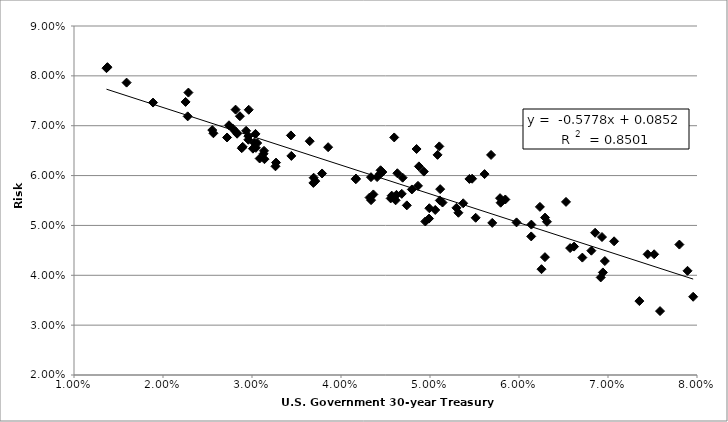
| Category | Series 0 |
|---|---|
| 0.07802062499999997 | 0.046 |
| 0.07893437499999999 | 0.041 |
| 0.07445446153846155 | 0.044 |
| 0.07518469696969694 | 0.044 |
| 0.07068396825396826 | 0.047 |
| 0.06855323076923074 | 0.049 |
| 0.06314272727272731 | 0.051 |
| 0.061389999999999986 | 0.05 |
| 0.06574515624999999 | 0.045 |
| 0.07352630769230767 | 0.035 |
| 0.07584772727272729 | 0.033 |
| 0.07956846153846153 | 0.036 |
| 0.06942584615384617 | 0.041 |
| 0.06711861538461537 | 0.044 |
| 0.06234815384615382 | 0.054 |
| 0.06292569230769232 | 0.052 |
| 0.06918323076923079 | 0.04 |
| 0.06964469696969697 | 0.043 |
| 0.06619 | 0.046 |
| 0.06813328125000001 | 0.045 |
| 0.06932415384615384 | 0.048 |
| 0.06528166666666667 | 0.055 |
| 0.06137227272727274 | 0.048 |
| 0.05846246153846155 | 0.055 |
| 0.05473196969696969 | 0.059 |
| 0.05104727272727275 | 0.066 |
| 0.05372968750000002 | 0.054 |
| 0.05794030769230768 | 0.055 |
| 0.06252848484848486 | 0.041 |
| 0.06291261538461539 | 0.044 |
| 0.059723230769230765 | 0.051 |
| 0.05787187500000002 | 0.055 |
| 0.05686107692307691 | 0.064 |
| 0.054425937500000014 | 0.059 |
| 0.05699338461538464 | 0.051 |
| 0.05297090909090909 | 0.054 |
| 0.0551321875 | 0.052 |
| 0.05612915384615385 | 0.06 |
| 0.0508485909090909 | 0.064 |
| 0.049307318181818195 | 0.061 |
| 0.048490953125 | 0.065 |
| 0.04597904615384617 | 0.068 |
| 0.051104863636363636 | 0.055 |
| 0.05114219696969698 | 0.057 |
| 0.048753138461538476 | 0.062 |
| 0.05319286153846153 | 0.053 |
| 0.05058801515151515 | 0.053 |
| 0.04864845454545455 | 0.058 |
| 0.046927312499999985 | 0.06 |
| 0.04465093846153847 | 0.061 |
| 0.044381742424242414 | 0.06 |
| 0.046829078125 | 0.056 |
| 0.04633183076923076 | 0.06 |
| 0.05140650769230769 | 0.055 |
| 0.0499256923076923 | 0.053 |
| 0.04739560000000001 | 0.054 |
| 0.047964107692307696 | 0.057 |
| 0.049891384615384615 | 0.051 |
| 0.04947043076923079 | 0.051 |
| 0.046137848484848476 | 0.055 |
| 0.044057984615384606 | 0.06 |
| 0.045697861538461525 | 0.056 |
| 0.04444857575757576 | 0.061 |
| 0.03648545454545455 | 0.067 |
| 0.034371828125000004 | 0.068 |
| 0.04167533846153845 | 0.059 |
| 0.043207924242424235 | 0.056 |
| 0.04336901515151515 | 0.06 |
| 0.04623328125000001 | 0.056 |
| 0.04363555384615385 | 0.056 |
| 0.03855463636363636 | 0.066 |
| 0.041662787878787896 | 0.059 |
| 0.04558379687499998 | 0.055 |
| 0.043380446153846154 | 0.055 |
| 0.03692825757575758 | 0.06 |
| 0.03039281538461539 | 0.068 |
| 0.03135133846153847 | 0.065 |
| 0.029340830769230764 | 0.069 |
| 0.02741293846153846 | 0.07 |
| 0.028642166666666666 | 0.072 |
| 0.031295609375 | 0.064 |
| 0.031398800000000004 | 0.063 |
| 0.0371136212121212 | 0.059 |
| 0.03787227272727271 | 0.06 |
| 0.03689290624999999 | 0.059 |
| 0.034420169230769224 | 0.064 |
| 0.032637651515151515 | 0.062 |
| 0.029634439393939404 | 0.073 |
| 0.025536187500000005 | 0.069 |
| 0.028846923076923076 | 0.065 |
| 0.029591227272727273 | 0.068 |
| 0.029592590909090898 | 0.067 |
| 0.0271972 | 0.068 |
| 0.025666046153846152 | 0.068 |
| 0.022773333333333333 | 0.072 |
| 0.028326507692307684 | 0.068 |
| 0.030435492307692304 | 0.066 |
| 0.02895535384615384 | 0.066 |
| 0.028157476923076918 | 0.073 |
| 0.028170630769230768 | 0.069 |
| 0.030233969230769233 | 0.067 |
| 0.030863630769230772 | 0.063 |
| 0.030584523076923074 | 0.067 |
| 0.03270189393939394 | 0.063 |
| 0.030102703124999998 | 0.065 |
| 0.027823599999999997 | 0.069 |
| 0.02285531818181818 | 0.077 |
| 0.02253839393939394 | 0.075 |
| 0.01888032307692307 | 0.075 |
| 0.013756846153846161 | 0.082 |
| 0.013650969696969693 | 0.082 |
| 0.015911418604651163 | 0.079 |